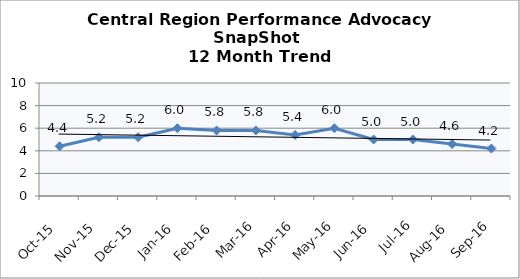
| Category | Central Region |
|---|---|
| Oct-15 | 4.4 |
| Nov-15 | 5.2 |
| Dec-15 | 5.2 |
| Jan-16 | 6 |
| Feb-16 | 5.8 |
| Mar-16 | 5.8 |
| Apr-16 | 5.4 |
| May-16 | 6 |
| Jun-16 | 5 |
| Jul-16 | 5 |
| Aug-16 | 4.6 |
| Sep-16 | 4.2 |